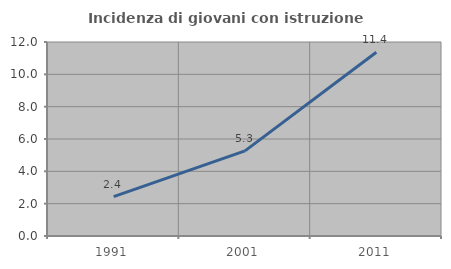
| Category | Incidenza di giovani con istruzione universitaria |
|---|---|
| 1991.0 | 2.439 |
| 2001.0 | 5.263 |
| 2011.0 | 11.364 |